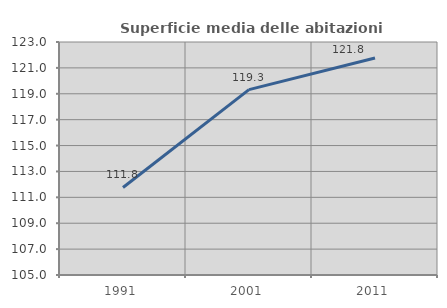
| Category | Superficie media delle abitazioni occupate |
|---|---|
| 1991.0 | 111.761 |
| 2001.0 | 119.324 |
| 2011.0 | 121.767 |